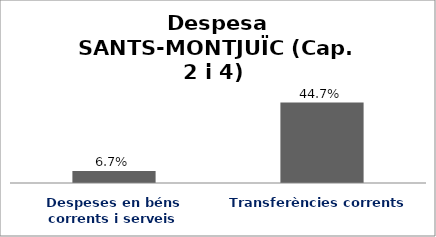
| Category | Series 0 |
|---|---|
| Despeses en béns corrents i serveis | 0.067 |
| Transferències corrents | 0.447 |